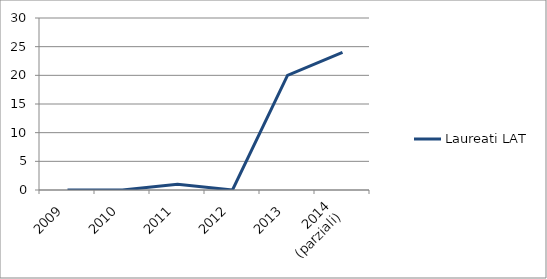
| Category | Laureati LAT |
|---|---|
| 2009 | 0 |
| 2010 | 0 |
| 2011 | 1 |
| 2012 | 0 |
| 2013 | 20 |
| 2014
(parziali) | 24 |